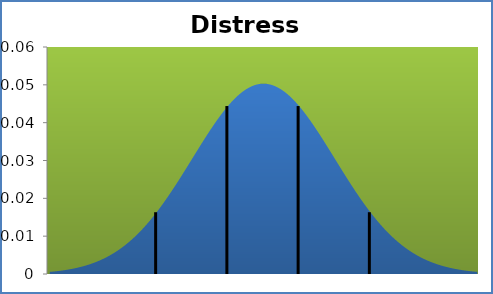
| Category | densité |
|---|---|
| 23.33 | 0.001 |
| 23.726499999999998 | 0.001 |
| 24.122999999999998 | 0.001 |
| 24.519499999999997 | 0.001 |
| 24.915999999999997 | 0.001 |
| 25.3125 | 0.001 |
| 25.709 | 0.001 |
| 26.1055 | 0.002 |
| 26.501999999999995 | 0.002 |
| 26.8985 | 0.002 |
| 27.294999999999998 | 0.002 |
| 27.691499999999998 | 0.003 |
| 28.087999999999997 | 0.003 |
| 28.484499999999997 | 0.003 |
| 28.881 | 0.004 |
| 29.2775 | 0.004 |
| 29.674 | 0.004 |
| 30.070499999999996 | 0.005 |
| 30.467 | 0.006 |
| 30.8635 | 0.006 |
| 31.259999999999998 | 0.007 |
| 31.656499999999998 | 0.008 |
| 32.053 | 0.008 |
| 32.4495 | 0.009 |
| 32.846 | 0.01 |
| 33.24249999999999 | 0.011 |
| 33.638999999999996 | 0.012 |
| 34.0355 | 0.013 |
| 34.432 | 0.014 |
| 34.8285 | 0.015 |
| 35.224999999999994 | 0.016 |
| 35.6215 | 0.018 |
| 36.018 | 0.019 |
| 36.4145 | 0.02 |
| 36.81099999999999 | 0.022 |
| 37.207499999999996 | 0.023 |
| 37.604 | 0.024 |
| 38.0005 | 0.026 |
| 38.397 | 0.027 |
| 38.793499999999995 | 0.029 |
| 39.19 | 0.031 |
| 39.5865 | 0.032 |
| 39.983 | 0.034 |
| 40.3795 | 0.035 |
| 40.775999999999996 | 0.037 |
| 41.1725 | 0.038 |
| 41.568999999999996 | 0.039 |
| 41.9655 | 0.041 |
| 42.361999999999995 | 0.042 |
| 42.7585 | 0.043 |
| 43.155 | 0.044 |
| 43.5515 | 0.045 |
| 43.948 | 0.046 |
| 44.3445 | 0.047 |
| 44.741 | 0.048 |
| 45.137499999999996 | 0.049 |
| 45.534 | 0.049 |
| 45.930499999999995 | 0.05 |
| 46.327 | 0.05 |
| 46.723499999999994 | 0.05 |
| 47.12 | 0.05 |
| 47.5165 | 0.05 |
| 47.913 | 0.05 |
| 48.3095 | 0.05 |
| 48.705999999999996 | 0.049 |
| 49.1025 | 0.049 |
| 49.498999999999995 | 0.048 |
| 49.8955 | 0.047 |
| 50.291999999999994 | 0.046 |
| 50.6885 | 0.045 |
| 51.084999999999994 | 0.044 |
| 51.4815 | 0.043 |
| 51.878 | 0.042 |
| 52.274499999999996 | 0.041 |
| 52.671 | 0.039 |
| 53.067499999999995 | 0.038 |
| 53.464 | 0.037 |
| 53.860499999999995 | 0.035 |
| 54.257 | 0.034 |
| 54.653499999999994 | 0.032 |
| 55.05 | 0.031 |
| 55.4465 | 0.029 |
| 55.842999999999996 | 0.027 |
| 56.23949999999999 | 0.026 |
| 56.635999999999996 | 0.024 |
| 57.0325 | 0.023 |
| 57.429 | 0.022 |
| 57.8255 | 0.02 |
| 58.221999999999994 | 0.019 |
| 58.6185 | 0.018 |
| 59.015 | 0.016 |
| 59.4115 | 0.015 |
| 59.80799999999999 | 0.014 |
| 60.204499999999996 | 0.013 |
| 60.601 | 0.012 |
| 60.9975 | 0.011 |
| 61.394 | 0.01 |
| 61.790499999999994 | 0.009 |
| 62.187 | 0.008 |
| 62.5835 | 0.008 |
| 62.98 | 0.007 |
| 63.37649999999999 | 0.006 |
| 63.772999999999996 | 0.006 |
| 64.1695 | 0.005 |
| 64.566 | 0.004 |
| 64.96249999999999 | 0.004 |
| 65.359 | 0.004 |
| 65.7555 | 0.003 |
| 66.152 | 0.003 |
| 66.54849999999999 | 0.003 |
| 66.945 | 0.002 |
| 67.3415 | 0.002 |
| 67.738 | 0.002 |
| 68.1345 | 0.002 |
| 68.53099999999999 | 0.001 |
| 68.9275 | 0.001 |
| 69.324 | 0.001 |
| 69.7205 | 0.001 |
| 70.11699999999999 | 0.001 |
| 70.5135 | 0.001 |
| 70.91 | 0.001 |